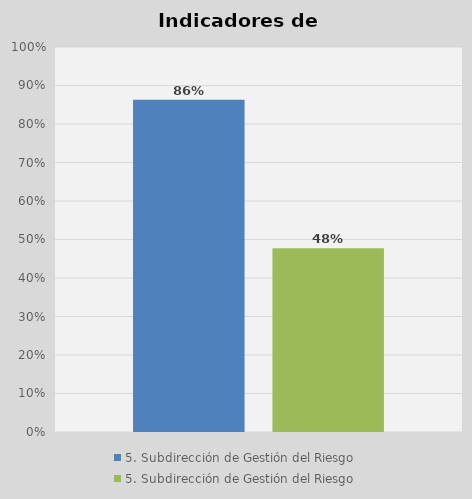
| Category | 5. Subdirección de Gestión del Riesgo |
|---|---|
| 0 | 0.477 |